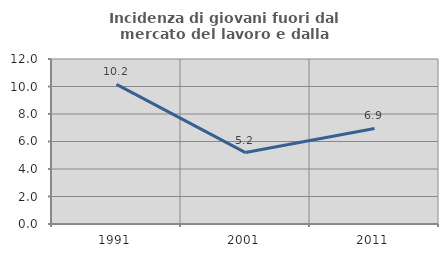
| Category | Incidenza di giovani fuori dal mercato del lavoro e dalla formazione  |
|---|---|
| 1991.0 | 10.159 |
| 2001.0 | 5.195 |
| 2011.0 | 6.95 |